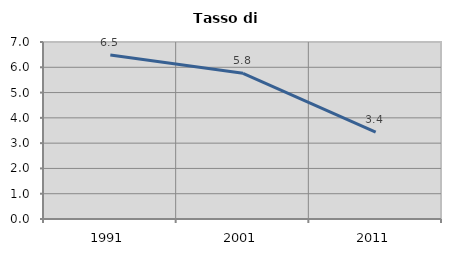
| Category | Tasso di disoccupazione   |
|---|---|
| 1991.0 | 6.488 |
| 2001.0 | 5.762 |
| 2011.0 | 3.437 |